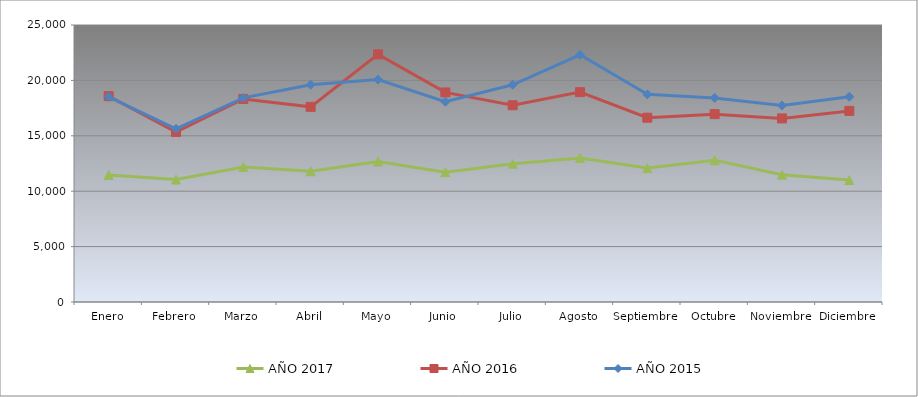
| Category | AÑO 2017 | AÑO 2016 | AÑO 2015 |
|---|---|---|---|
| Enero | 11459.172 | 18581.121 | 18518.395 |
| Febrero | 11049.008 | 15343.704 | 15636.209 |
| Marzo | 12192.53 | 18324.881 | 18426.003 |
| Abril | 11800.792 | 17613.284 | 19612.688 |
| Mayo | 12683.769 | 22351.52 | 20076.798 |
| Junio | 11720.822 | 18914.278 | 18077.728 |
| Julio | 12482.556 | 17756.958 | 19606.132 |
| Agosto | 12996.275 | 18941.251 | 22313.634 |
| Septiembre | 12087.133 | 16634.148 | 18740.927 |
| Octubre | 12802.801 | 16953.997 | 18420.523 |
| Noviembre | 11483.126 | 16569.389 | 17736.533 |
| Diciembre | 11006.996 | 17246.808 | 18525.385 |